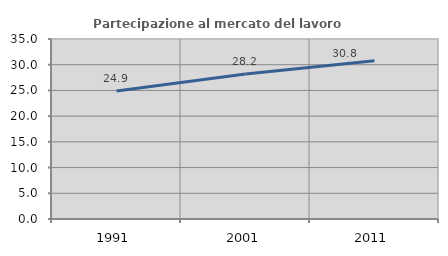
| Category | Partecipazione al mercato del lavoro  femminile |
|---|---|
| 1991.0 | 24.873 |
| 2001.0 | 28.191 |
| 2011.0 | 30.769 |